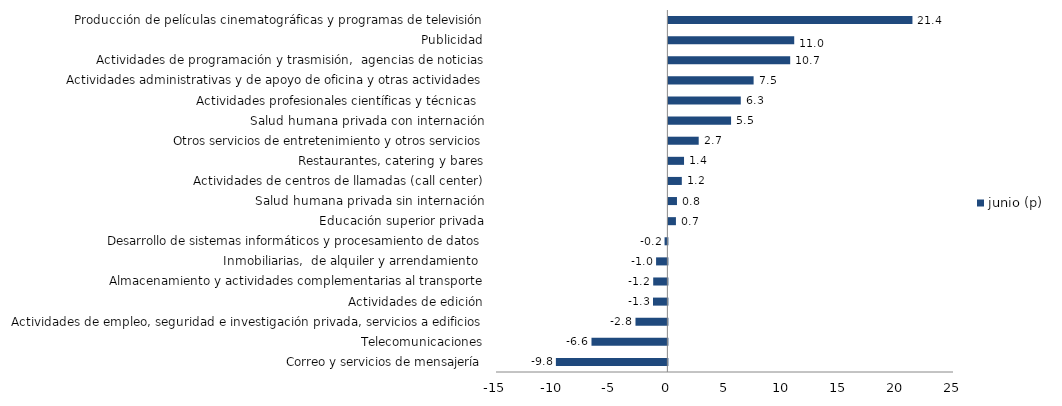
| Category | junio (p) |
|---|---|
| Correo y servicios de mensajería | -9.758 |
| Telecomunicaciones | -6.642 |
| Actividades de empleo, seguridad e investigación privada, servicios a edificios | -2.791 |
| Actividades de edición | -1.26 |
| Almacenamiento y actividades complementarias al transporte | -1.241 |
| Inmobiliarias,  de alquiler y arrendamiento  | -0.989 |
| Desarrollo de sistemas informáticos y procesamiento de datos | -0.247 |
| Educación superior privada | 0.661 |
| Salud humana privada sin internación | 0.752 |
| Actividades de centros de llamadas (call center) | 1.177 |
| Restaurantes, catering y bares | 1.371 |
| Otros servicios de entretenimiento y otros servicios | 2.655 |
| Salud humana privada con internación | 5.487 |
| Actividades profesionales científicas y técnicas  | 6.338 |
| Actividades administrativas y de apoyo de oficina y otras actividades | 7.461 |
| Actividades de programación y trasmisión,  agencias de noticias | 10.663 |
| Publicidad | 11.015 |
| Producción de películas cinematográficas y programas de televisión | 21.363 |